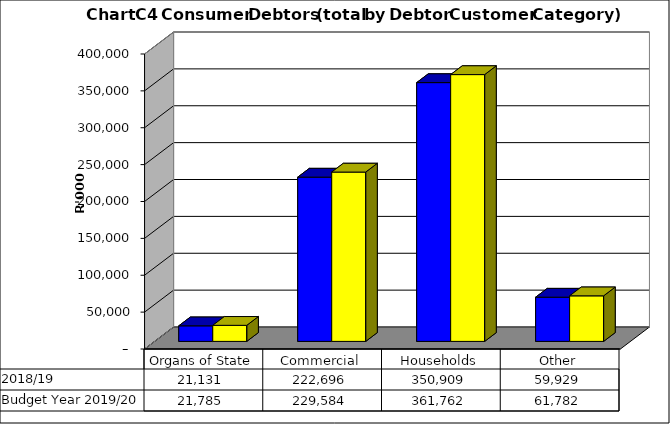
| Category |  2018/19  | Budget Year 2019/20 |
|---|---|---|
| Organs of State | 21131045.316 | 21784582.8 |
| Commercial | 222696023.305 | 229583529.18 |
| Households | 350909020.263 | 361761876.56 |
| Other | 59928607.328 | 61782069.41 |